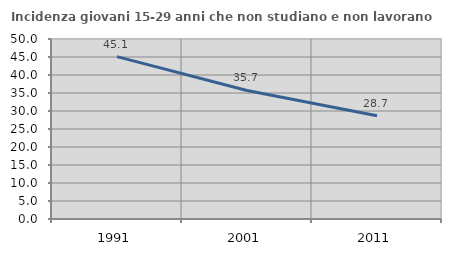
| Category | Incidenza giovani 15-29 anni che non studiano e non lavorano  |
|---|---|
| 1991.0 | 45.113 |
| 2001.0 | 35.705 |
| 2011.0 | 28.699 |